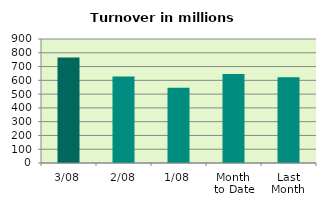
| Category | Series 0 |
|---|---|
| 3/08 | 765.146 |
| 2/08 | 626.946 |
| 1/08 | 545.619 |
| Month 
to Date | 645.904 |
| Last
Month | 622.259 |